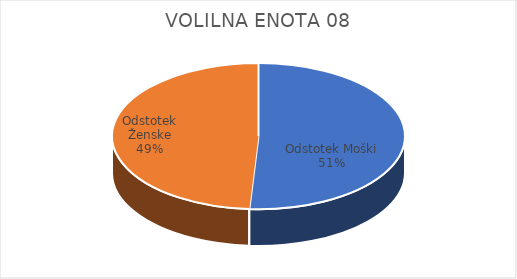
| Category | VOLILNA ENOTA 08 | #REF! | Slovenija skupaj |
|---|---|---|---|
| Odstotek Moški | 12.33 |  | 13.7 |
| Odstotek Ženske | 11.85 |  | 14.52 |